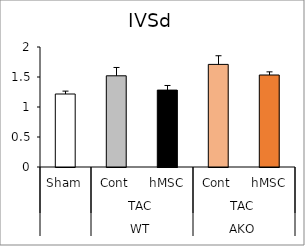
| Category | Series 0 |
|---|---|
| 0 | 1.217 |
| 1 | 1.52 |
| 2 | 1.282 |
| 3 | 1.71 |
| 4 | 1.533 |